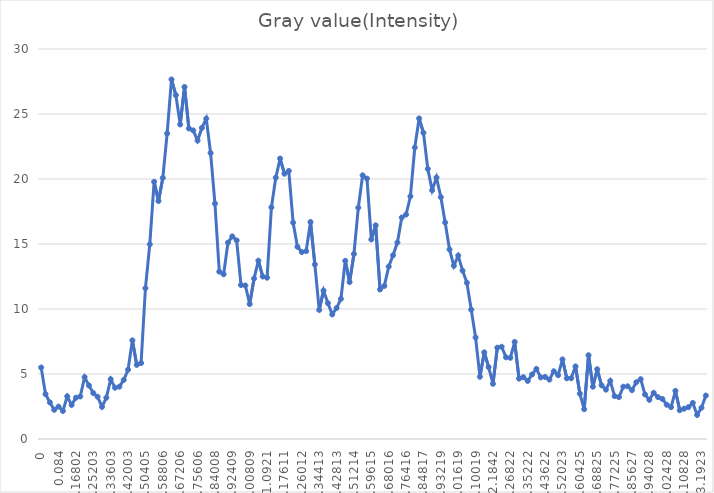
| Category | Series 0 |
|---|---|
| 0.0 | 5.5 |
| 0.021 | 3.453 |
| 0.042 | 2.816 |
| 0.063 | 2.243 |
| 0.084 | 2.494 |
| 0.10501 | 2.157 |
| 0.12601 | 3.283 |
| 0.14702 | 2.622 |
| 0.16802 | 3.175 |
| 0.18902 | 3.272 |
| 0.21002 | 4.759 |
| 0.23102 | 4.112 |
| 0.25203 | 3.531 |
| 0.27303 | 3.248 |
| 0.29403 | 2.47 |
| 0.31503 | 3.176 |
| 0.33603 | 4.595 |
| 0.35703 | 3.944 |
| 0.37803 | 4.023 |
| 0.39903 | 4.542 |
| 0.42003 | 5.329 |
| 0.44105 | 7.585 |
| 0.46205 | 5.698 |
| 0.48305 | 5.843 |
| 0.50405 | 11.595 |
| 0.52505 | 14.975 |
| 0.54605 | 19.782 |
| 0.56705 | 18.304 |
| 0.58806 | 20.083 |
| 0.60906 | 23.504 |
| 0.63006 | 27.659 |
| 0.65106 | 26.457 |
| 0.67206 | 24.193 |
| 0.69306 | 27.081 |
| 0.71406 | 23.889 |
| 0.73506 | 23.738 |
| 0.75606 | 22.957 |
| 0.77708 | 23.931 |
| 0.79808 | 24.645 |
| 0.81908 | 22.004 |
| 0.84008 | 18.105 |
| 0.86108 | 12.872 |
| 0.88208 | 12.672 |
| 0.90308 | 15.102 |
| 0.92409 | 15.588 |
| 0.94509 | 15.277 |
| 0.96609 | 11.845 |
| 0.98709 | 11.809 |
| 1.00809 | 10.379 |
| 1.02909 | 12.335 |
| 1.05009 | 13.718 |
| 1.0711 | 12.5 |
| 1.0921 | 12.406 |
| 1.11311 | 17.823 |
| 1.13411 | 20.102 |
| 1.15511 | 21.571 |
| 1.17611 | 20.407 |
| 1.19711 | 20.622 |
| 1.21811 | 16.64 |
| 1.23911 | 14.787 |
| 1.26012 | 14.381 |
| 1.28112 | 14.454 |
| 1.30212 | 16.69 |
| 1.32312 | 13.429 |
| 1.34413 | 9.927 |
| 1.36513 | 11.418 |
| 1.38613 | 10.452 |
| 1.40713 | 9.587 |
| 1.42813 | 10.074 |
| 1.44914 | 10.777 |
| 1.47014 | 13.704 |
| 1.49114 | 12.069 |
| 1.51214 | 14.232 |
| 1.53314 | 17.794 |
| 1.55414 | 20.281 |
| 1.57514 | 20.031 |
| 1.59615 | 15.348 |
| 1.61715 | 16.436 |
| 1.63816 | 11.504 |
| 1.65916 | 11.774 |
| 1.68016 | 13.262 |
| 1.70116 | 14.132 |
| 1.72216 | 15.112 |
| 1.74316 | 17.036 |
| 1.76416 | 17.265 |
| 1.78517 | 18.667 |
| 1.80617 | 22.42 |
| 1.82717 | 24.661 |
| 1.84817 | 23.555 |
| 1.86917 | 20.777 |
| 1.89017 | 19.133 |
| 1.91117 | 20.116 |
| 1.93219 | 18.61 |
| 1.95319 | 16.649 |
| 1.97419 | 14.58 |
| 1.99519 | 13.32 |
| 2.01619 | 14.107 |
| 2.03719 | 12.953 |
| 2.05819 | 12.015 |
| 2.07919 | 9.945 |
| 2.10019 | 7.807 |
| 2.1212 | 4.784 |
| 2.1422 | 6.667 |
| 2.1632 | 5.532 |
| 2.1842 | 4.246 |
| 2.2052 | 7.024 |
| 2.2262 | 7.095 |
| 2.2472 | 6.286 |
| 2.26822 | 6.247 |
| 2.28922 | 7.469 |
| 2.31022 | 4.641 |
| 2.33122 | 4.754 |
| 2.35222 | 4.467 |
| 2.37322 | 4.963 |
| 2.39422 | 5.389 |
| 2.41522 | 4.736 |
| 2.43622 | 4.77 |
| 2.45723 | 4.568 |
| 2.47823 | 5.213 |
| 2.49923 | 4.907 |
| 2.52023 | 6.123 |
| 2.54123 | 4.668 |
| 2.56224 | 4.675 |
| 2.58324 | 5.585 |
| 2.60425 | 3.492 |
| 2.62525 | 2.292 |
| 2.64625 | 6.443 |
| 2.66725 | 4.022 |
| 2.68825 | 5.368 |
| 2.70925 | 4.125 |
| 2.73025 | 3.795 |
| 2.75125 | 4.469 |
| 2.77225 | 3.298 |
| 2.79326 | 3.22 |
| 2.81426 | 4.021 |
| 2.83527 | 4.052 |
| 2.85627 | 3.759 |
| 2.87727 | 4.368 |
| 2.89827 | 4.602 |
| 2.91927 | 3.427 |
| 2.94028 | 3.01 |
| 2.96128 | 3.549 |
| 2.98228 | 3.217 |
| 3.00328 | 3.08 |
| 3.02428 | 2.635 |
| 3.04528 | 2.45 |
| 3.06628 | 3.705 |
| 3.08728 | 2.211 |
| 3.10828 | 2.33 |
| 3.1293 | 2.447 |
| 3.1503 | 2.776 |
| 3.1713 | 1.849 |
| 3.1923 | 2.404 |
| 3.2133 | 3.342 |